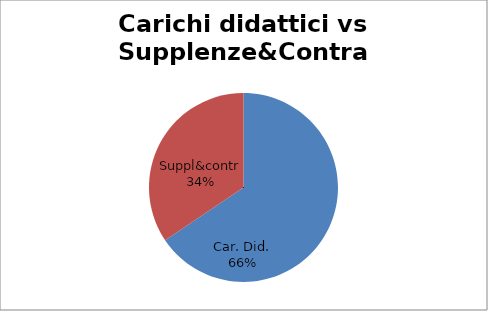
| Category | Series 0 |
|---|---|
| Car. Did. | 0.656 |
| Suppl&contr | 0.344 |